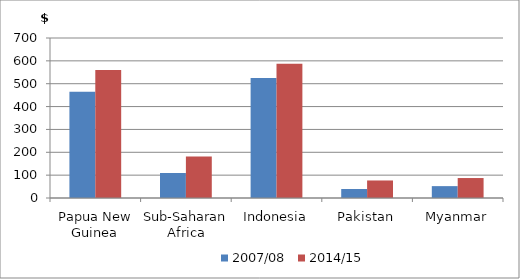
| Category | 2007/08 | 2014/15 |
|---|---|---|
| Papua New Guinea | 465.142 | 560.207 |
| Sub-Saharan Africa | 109.351 | 181.429 |
| Indonesia | 525.254 | 587.581 |
| Pakistan | 39.335 | 76.687 |
| Myanmar | 51.946 | 87.365 |